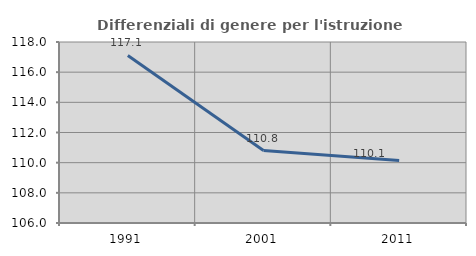
| Category | Differenziali di genere per l'istruzione superiore |
|---|---|
| 1991.0 | 117.111 |
| 2001.0 | 110.803 |
| 2011.0 | 110.145 |